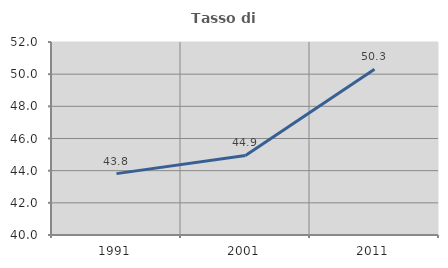
| Category | Tasso di occupazione   |
|---|---|
| 1991.0 | 43.816 |
| 2001.0 | 44.949 |
| 2011.0 | 50.304 |